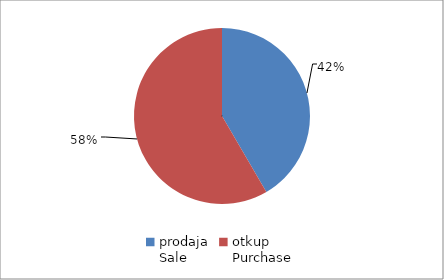
| Category | Series 0 |
|---|---|
| prodaja
Sale | 91792028.79 |
| otkup
Purchase | 128912395.5 |